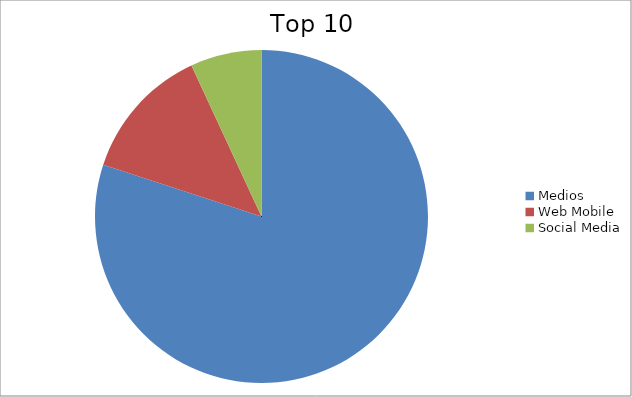
| Category | Series 0 |
|---|---|
| Medios | 80.03 |
| Web Mobile | 13.06 |
| Social Media | 6.91 |